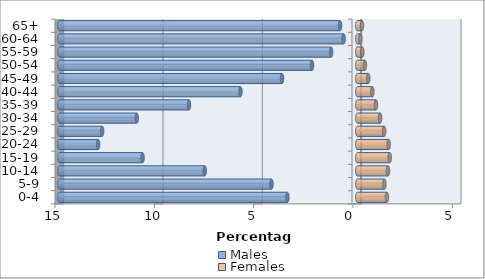
| Category | Males | Females |
|---|---|---|
| 0-4 | -3.522 | 1.488 |
| 5-9 | -4.321 | 1.361 |
| 10-14 | -7.68 | 1.544 |
| 15-19 | -10.811 | 1.632 |
| 20-24 | -13.047 | 1.578 |
| 25-29 | -12.846 | 1.352 |
| 30-34 | -11.104 | 1.146 |
| 35-39 | -8.475 | 0.938 |
| 40-44 | -5.884 | 0.755 |
| 45-49 | -3.789 | 0.551 |
| 50-54 | -2.281 | 0.382 |
| 55-59 | -1.319 | 0.248 |
| 60-64 | -0.691 | 0.151 |
| 65+ | -0.869 | 0.235 |